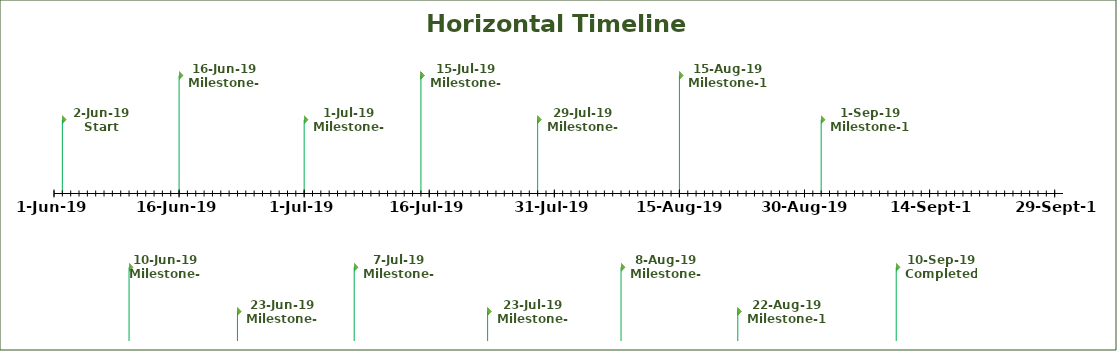
| Category | Position |
|---|---|
| 43618.0 | 50 |
| 43626.0 | -50 |
| 43632.0 | 80 |
| 43639.0 | -80 |
| 43647.0 | 50 |
| 43653.0 | -50 |
| 43661.0 | 80 |
| 43669.0 | -80 |
| 43675.0 | 50 |
| 43685.0 | -50 |
| 43692.0 | 80 |
| 43699.0 | -80 |
| 43709.0 | 50 |
| 43718.0 | -50 |